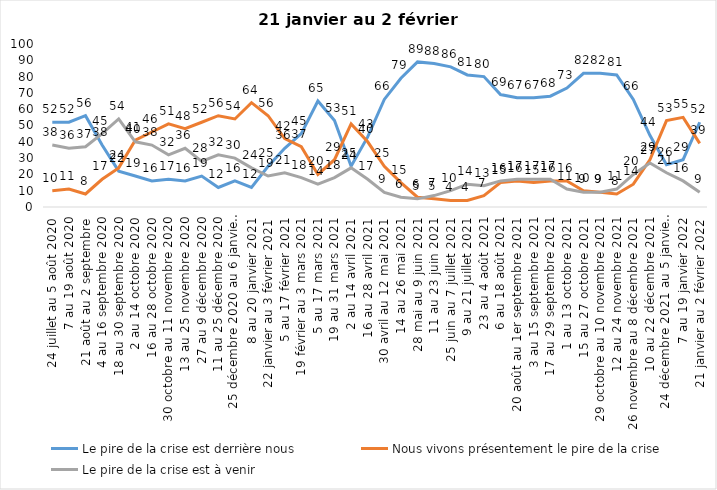
| Category | Le pire de la crise est derrière nous | Nous vivons présentement le pire de la crise | Le pire de la crise est à venir |
|---|---|---|---|
| 24 juillet au 5 août 2020 | 52 | 10 | 38 |
| 7 au 19 août 2020 | 52 | 11 | 36 |
| 21 août au 2 septembre | 56 | 8 | 37 |
| 4 au 16 septembre 2020 | 38 | 17 | 45 |
| 18 au 30 septembre 2020 | 22 | 24 | 54 |
| 2 au 14 octobre 2020 | 19 | 41 | 40 |
| 16 au 28 octobre 2020 | 16 | 46 | 38 |
| 30 octobre au 11 novembre 2020 | 17 | 51 | 32 |
| 13 au 25 novembre 2020 | 16 | 48 | 36 |
| 27 au 9 décembre 2020 | 19 | 52 | 28 |
| 11 au 25 décembre 2020 | 12 | 56 | 32 |
| 25 décembre 2020 au 6 janvier 2021 | 16 | 54 | 30 |
| 8 au 20 janvier 2021 | 12 | 64 | 24 |
| 22 janvier au 3 février 2021 | 25 | 56 | 19 |
| 5 au 17 février 2021 | 36 | 42 | 21 |
| 19 février au 3 mars 2021 | 45 | 37 | 18 |
| 5 au 17 mars 2021 | 65 | 20 | 14 |
| 19 au 31 mars 2021 | 53 | 29 | 18 |
| 2 au 14 avril 2021 | 25 | 51 | 24 |
| 16 au 28 avril 2021 | 43 | 40 | 17 |
| 30 avril au 12 mai 2021 | 66 | 25 | 9 |
| 14 au 26 mai 2021 | 79 | 15 | 6 |
| 28 mai au 9 juin 2021 | 89 | 6 | 5 |
| 11 au 23 juin 2021 | 88 | 5 | 7 |
| 25 juin au 7 juillet 2021 | 86 | 4 | 10 |
| 9 au 21 juillet 2021 | 81 | 4 | 14 |
| 23 au 4 août 2021 | 80 | 7 | 13 |
| 6 au 18 août 2021 | 69 | 15 | 16 |
| 20 août au 1er septembre 2021 | 67 | 16 | 17 |
| 3 au 15 septembre 2021 | 67 | 15 | 17 |
| 17 au 29 septembre 2021 | 68 | 16 | 17 |
| 1 au 13 octobre 2021 | 73 | 16 | 11 |
| 15 au 27 octobre 2021 | 82 | 10 | 9 |
| 29 octobre au 10 novembre 2021 | 82 | 9 | 9 |
| 12 au 24 novembre 2021 | 81 | 8 | 11 |
| 26 novembre au 8 décembre 2021 | 66 | 14 | 20 |
| 10 au 22 décembre 2021 | 44 | 29 | 27 |
| 24 décembre 2021 au 5 janvier 2022 | 26 | 53 | 21 |
| 7 au 19 janvier 2022 | 29 | 55 | 16 |
| 21 janvier au 2 février 2022 | 52 | 39 | 9 |